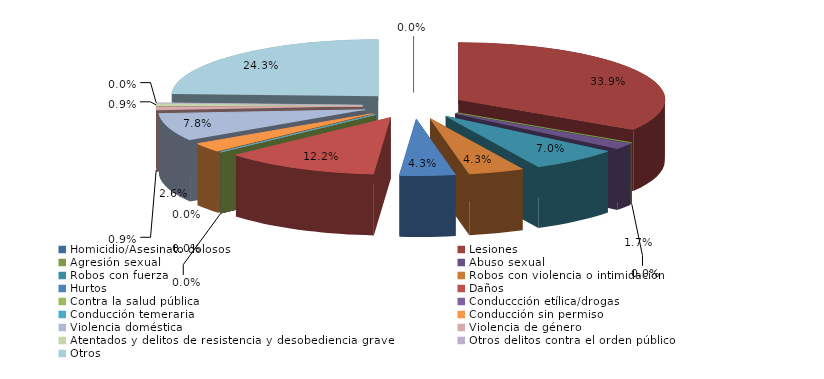
| Category | Series 0 |
|---|---|
| Homicidio/Asesinato dolosos | 0 |
| Lesiones | 39 |
| Agresión sexual | 0 |
| Abuso sexual | 2 |
| Robos con fuerza | 8 |
| Robos con violencia o intimidación | 5 |
| Hurtos | 5 |
| Daños | 14 |
| Contra la salud pública | 0 |
| Conduccción etílica/drogas | 0 |
| Conducción temeraria | 0 |
| Conducción sin permiso | 3 |
| Violencia doméstica | 9 |
| Violencia de género | 1 |
| Atentados y delitos de resistencia y desobediencia grave | 1 |
| Otros delitos contra el orden público | 0 |
| Otros | 28 |